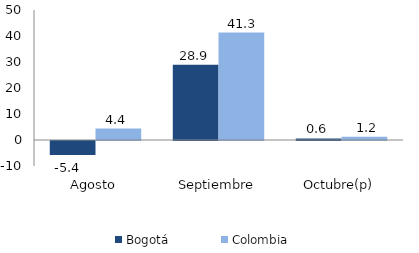
| Category | Bogotá | Colombia |
|---|---|---|
| Agosto | -5.402 | 4.39 |
| Septiembre | 28.926 | 41.331 |
| Octubre(p) | 0.597 | 1.215 |